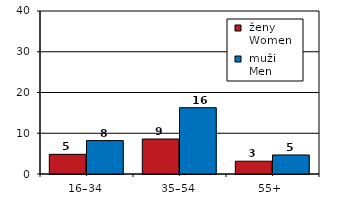
| Category |  ženy 
 Women |  muži 
 Men |
|---|---|---|
| 16–34 | 4.826 | 8.197 |
| 35–54 | 8.584 | 16.267 |
| 55+  | 3.137 | 4.668 |